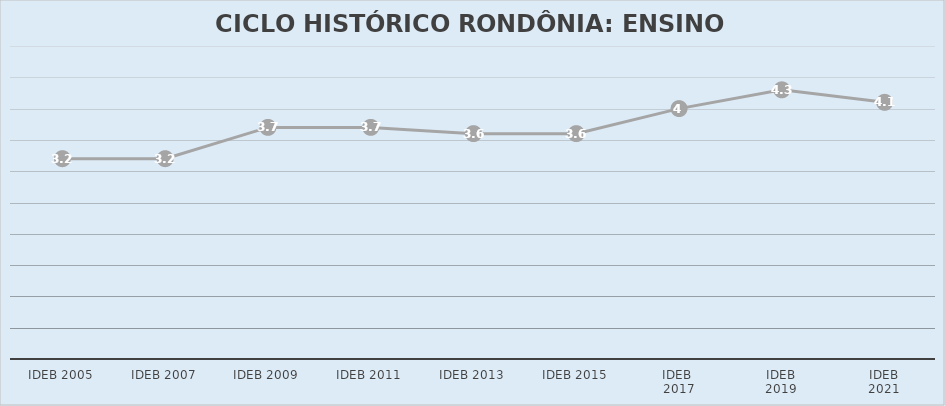
| Category | Series 0 | Series 1 | RONDÔNIA |
|---|---|---|---|
| IDEB 2005 |  |  | 3.2 |
| IDEB 2007 |  |  | 3.2 |
| IDEB 2009 |  |  | 3.7 |
| IDEB 2011 |  |  | 3.7 |
| IDEB 2013 |  |  | 3.6 |
| IDEB 2015 |  |  | 3.6 |
| IDEB 
2017 |  |  | 4 |
| IDEB
2019 |  |  | 4.3 |
| IDEB
2021 |  |  | 4.1 |